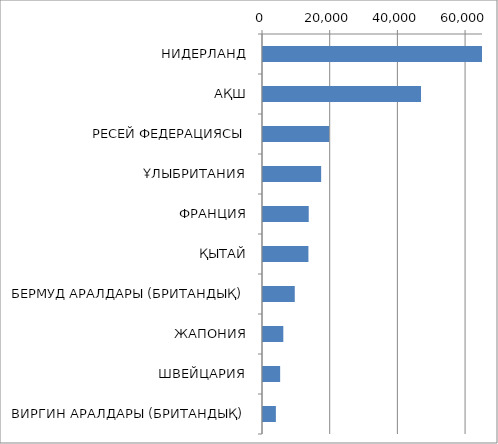
| Category | Series 0 |
|---|---|
| НИДЕРЛАНД | 65108.129 |
| АҚШ | 46688.436 |
| РЕСЕЙ ФЕДЕРАЦИЯСЫ | 19531.667 |
| ҰЛЫБРИТАНИЯ | 17182.363 |
| ФРАНЦИЯ | 13511.387 |
| ҚЫТАЙ | 13419.696 |
| БЕРМУД АРАЛДАРЫ (БРИТАНДЫҚ) | 9385.74 |
| ЖАПОНИЯ | 6001.081 |
| ШВЕЙЦАРИЯ | 5067.882 |
| ВИРГИН АРАЛДАРЫ (БРИТАНДЫҚ) | 3807.112 |